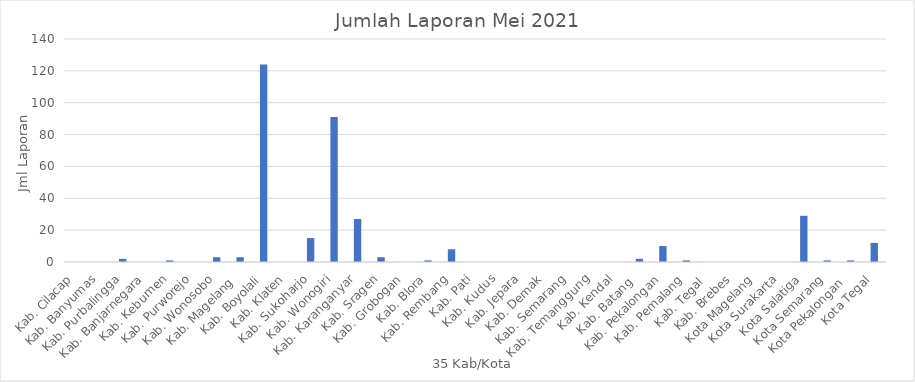
| Category | Series 0 |
|---|---|
| Kab. Cilacap | 0 |
| Kab. Banyumas | 0 |
| Kab. Purbalingga | 2 |
| Kab. Banjarnegara | 0 |
| Kab. Kebumen | 1 |
| Kab. Purworejo | 0 |
| Kab. Wonosobo | 3 |
| Kab. Magelang  | 3 |
| Kab. Boyolali | 124 |
| Kab. Klaten | 0 |
| Kab. Sukoharjo | 15 |
| Kab. Wonogiri | 91 |
| Kab. Karanganyar | 27 |
| Kab. Sragen | 3 |
| Kab. Grobogan | 0 |
| Kab. Blora | 1 |
| Kab. Rembang | 8 |
| Kab. Pati | 0 |
| Kab. Kudus | 0 |
| Kab. Jepara | 0 |
| Kab. Demak | 0 |
| Kab. Semarang | 0 |
| Kab. Temanggung | 0 |
| Kab. Kendal | 0 |
| Kab. Batang  | 2 |
| Kab. Pekalongan | 10 |
| Kab. Pemalang | 1 |
| Kab. Tegal  | 0 |
| Kab. Brebes | 0 |
| Kota Magelang | 0 |
| Kota Surakarta | 0 |
| Kota Salatiga | 29 |
| Kota Semarang | 1 |
| Kota Pekalongan  | 1 |
| Kota Tegal | 12 |